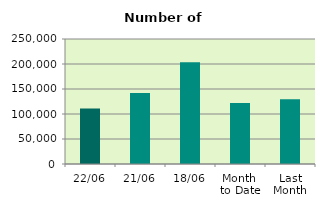
| Category | Series 0 |
|---|---|
| 22/06 | 110878 |
| 21/06 | 141810 |
| 18/06 | 203500 |
| Month 
to Date | 121872.875 |
| Last
Month | 129378.19 |